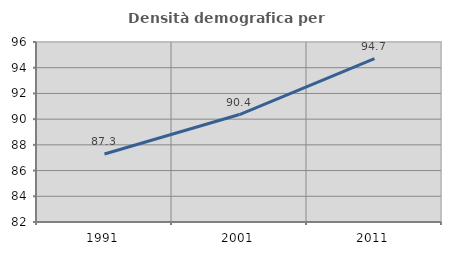
| Category | Densità demografica |
|---|---|
| 1991.0 | 87.289 |
| 2001.0 | 90.358 |
| 2011.0 | 94.7 |